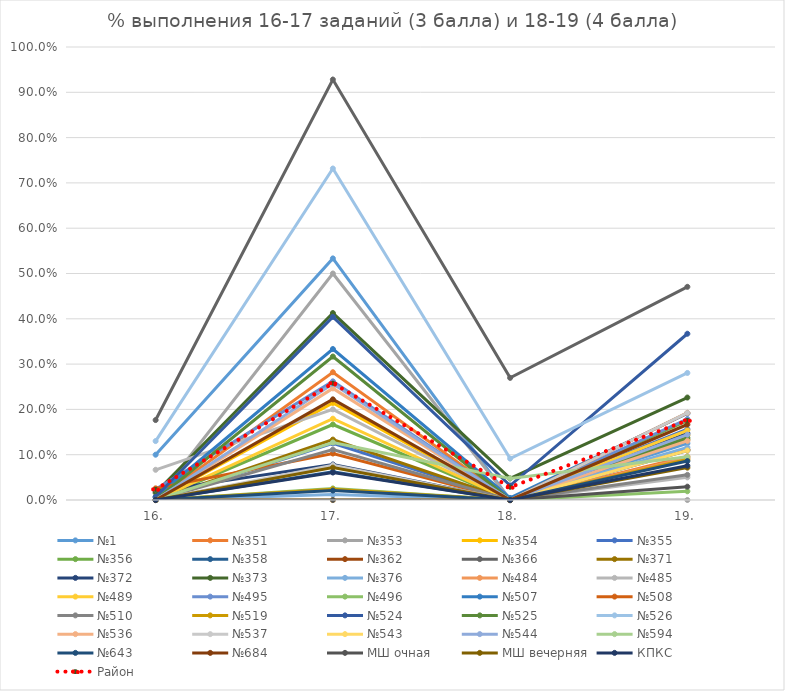
| Category | №1 | №351 | №353 | №354 | №355 | №356 | №358 | №362 | №366 | №371 | №372 | №373 | №376 | №484 | №485 | №489 | №495 | №496 | №507 | №508 | №510 | №519 | №524 | №525 | №526 | №536 | №537 | №543 | №544 | №594 | №643 | №684 | МШ очная | МШ вечерняя | КПКС | Район |
|---|---|---|---|---|---|---|---|---|---|---|---|---|---|---|---|---|---|---|---|---|---|---|---|---|---|---|---|---|---|---|---|---|---|---|---|---|
| 16. | 0.1 | 0 | 0 | 0 | 0 | 0 | 0 | 0 | 0.176 | 0 | 0.02 | 0.016 | 0 | 0 | 0.067 | 0 | 0.024 | 0 | 0.006 | 0.026 | 0 | 0 | 0.007 | 0 | 0.13 | 0 | 0 | 0 | 0 | 0 | 0 | 0 | 0 | 0 | 0 | 0.023 |
| 17. | 0.533 | 0.282 | 0.5 | 0.214 | 0.125 | 0.167 | 0.062 | 0.074 | 0.928 | 0.133 | 0.078 | 0.413 | 0.012 | 0 | 0.2 | 0.179 | 0.262 | 0.026 | 0.333 | 0.103 | 0.111 | 0.024 | 0.404 | 0.317 | 0.732 | 0.246 | 0.077 | 0 | 0.256 | 0.127 | 0.021 | 0.222 | 0 | 0.071 | 0.061 | 0.258 |
| 18. | 0 | 0 | 0 | 0 | 0 | 0 | 0 | 0 | 0.27 | 0 | 0 | 0.048 | 0 | 0 | 0 | 0 | 0 | 0 | 0.005 | 0 | 0 | 0 | 0.032 | 0 | 0.091 | 0 | 0 | 0 | 0 | 0.048 | 0 | 0 | 0 | 0 | 0 | 0.028 |
| 19. | 0.125 | 0.096 | 0 | 0.143 | 0.156 | 0.175 | 0.109 | 0.111 | 0.471 | 0.133 | 0.147 | 0.226 | 0.116 | 0.093 | 0.05 | 0.154 | 0.179 | 0.019 | 0.191 | 0.192 | 0.056 | 0.089 | 0.367 | 0.138 | 0.28 | 0.13 | 0.192 | 0.109 | 0.144 | 0.095 | 0.086 | 0.167 | 0.029 | 0.071 | 0.076 | 0.176 |